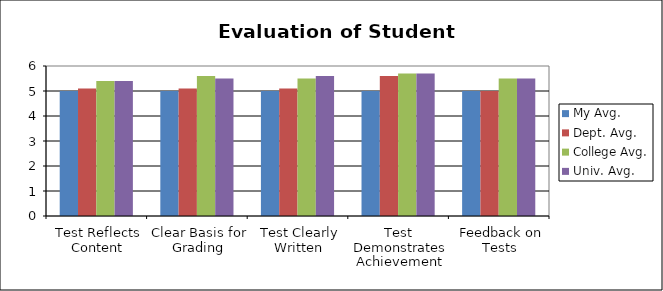
| Category | My Avg. | Dept. Avg. | College Avg. | Univ. Avg. |
|---|---|---|---|---|
| Test Reflects Content | 5 | 5.1 | 5.4 | 5.4 |
| Clear Basis for Grading | 5 | 5.1 | 5.6 | 5.5 |
| Test Clearly Written | 5 | 5.1 | 5.5 | 5.6 |
| Test Demonstrates Achievement | 5 | 5.6 | 5.7 | 5.7 |
| Feedback on Tests | 5 | 5 | 5.5 | 5.5 |